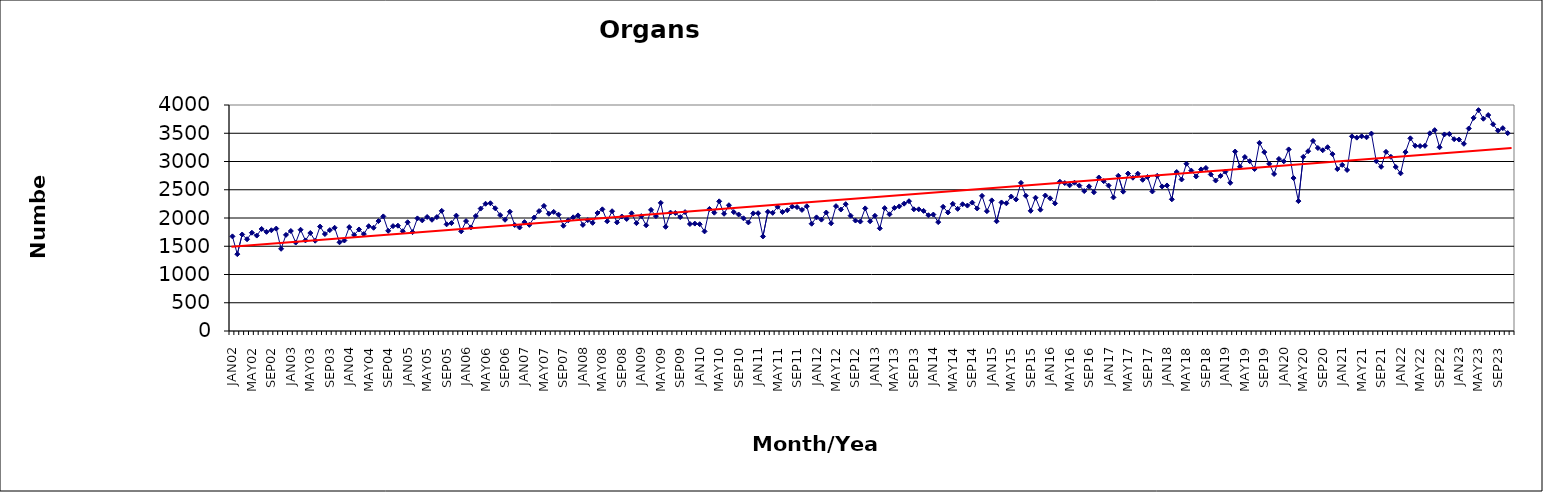
| Category | Series 0 |
|---|---|
| JAN02 | 1675 |
| FEB02 | 1360 |
| MAR02 | 1708 |
| APR02 | 1624 |
| MAY02 | 1740 |
| JUN02 | 1689 |
| JUL02 | 1806 |
| AUG02 | 1755 |
| SEP02 | 1783 |
| OCT02 | 1813 |
| NOV02 | 1455 |
| DEC02 | 1701 |
| JAN03 | 1770 |
| FEB03 | 1565 |
| MAR03 | 1792 |
| APR03 | 1603 |
| MAY03 | 1734 |
| JUN03 | 1598 |
| JUL03 | 1848 |
| AUG03 | 1716 |
| SEP03 | 1785 |
| OCT03 | 1827 |
| NOV03 | 1570 |
| DEC03 | 1602 |
| JAN04 | 1839 |
| FEB04 | 1700 |
| MAR04 | 1797 |
| APR04 | 1715 |
| MAY04 | 1855 |
| JUN04 | 1827 |
| JUL04 | 1946 |
| AUG04 | 2028 |
| SEP04 | 1773 |
| OCT04 | 1857 |
| NOV04 | 1864 |
| DEC04 | 1766 |
| JAN05 | 1925 |
| FEB05 | 1750 |
| MAR05 | 1993 |
| APR05 | 1958 |
| MAY05 | 2018 |
| JUN05 | 1969 |
| JUL05 | 2016 |
| AUG05 | 2127 |
| SEP05 | 1888 |
| OCT05 | 1910 |
| NOV05 | 2042 |
| DEC05 | 1764 |
| JAN06 | 1945 |
| FEB06 | 1834 |
| MAR06 | 2035 |
| APR06 | 2167 |
| MAY06 | 2252 |
| JUN06 | 2261 |
| JUL06 | 2172 |
| AUG06 | 2051 |
| SEP06 | 1969 |
| OCT06 | 2111 |
| NOV06 | 1876 |
| DEC06 | 1832 |
| JAN07 | 1927 |
| FEB07 | 1878 |
| MAR07 | 2009 |
| APR07 | 2122 |
| MAY07 | 2214 |
| JUN07 | 2076 |
| JUL07 | 2108 |
| AUG07 | 2060 |
| SEP07 | 1863 |
| OCT07 | 1959 |
| NOV07 | 2012 |
| DEC07 | 2046 |
| JAN08 | 1878 |
| FEB08 | 1962 |
| MAR08 | 1914 |
| APR08 | 2089 |
| MAY08 | 2153 |
| JUN08 | 1942 |
| JUL08 | 2120 |
| AUG08 | 1923 |
| SEP08 | 2026 |
| OCT08 | 1983 |
| NOV08 | 2083 |
| DEC08 | 1909 |
| JAN09 | 2033 |
| FEB09 | 1871 |
| MAR09 | 2144 |
| APR09 | 2033 |
| MAY09 | 2268 |
| JUN09 | 1844 |
| JUL09 | 2096 |
| AUG09 | 2089 |
| SEP09 | 2016 |
| OCT09 | 2104 |
| NOV09 | 1894 |
| DEC09 | 1901 |
| JAN10 | 1890 |
| FEB10 | 1763 |
| MAR10 | 2160 |
| APR10 | 2094 |
| MAY10 | 2295 |
| JUN10 | 2075 |
| JUL10 | 2226 |
| AUG10 | 2105 |
| SEP10 | 2062 |
| OCT10 | 1995 |
| NOV10 | 1922 |
| DEC10 | 2082 |
| JAN11 | 2085 |
| FEB11 | 1674 |
| MAR11 | 2109 |
| APR11 | 2091 |
| MAY11 | 2198 |
| JUN11 | 2106 |
| JUL11 | 2137 |
| AUG11 | 2202 |
| SEP11 | 2193 |
| OCT11 | 2143 |
| NOV11 | 2208 |
| DEC11 | 1899 |
| JAN12 | 2011 |
| FEB12 | 1971 |
| MAR12 | 2097 |
| APR12 | 1906 |
| MAY12 | 2210 |
| JUN12 | 2150 |
| JUL12 | 2245 |
| AUG12 | 2041 |
| SEP12 | 1955 |
| OCT12 | 1937 |
| NOV12 | 2170 |
| DEC12 | 1942 |
| JAN13 | 2039 |
| FEB13 | 1817 |
| MAR13 | 2175 |
| APR13 | 2065 |
| MAY13 | 2179 |
| JUN13 | 2205 |
| JUL13 | 2254 |
| AUG13 | 2297 |
| SEP13 | 2154 |
| OCT13 | 2154 |
| NOV13 | 2126 |
| DEC13 | 2049 |
| JAN14 | 2061 |
| FEB14 | 1927 |
| MAR14 | 2198 |
| APR14 | 2098 |
| MAY14 | 2251 |
| JUN14 | 2162 |
| JUL14 | 2243 |
| AUG14 | 2220 |
| SEP14 | 2273 |
| OCT14 | 2169 |
| NOV14 | 2392 |
| DEC14 | 2121 |
| JAN15 | 2312 |
| FEB15 | 1942 |
| MAR15 | 2275 |
| APR15 | 2260 |
| MAY15 | 2380 |
| JUN15 | 2329 |
| JUL15 | 2622 |
| AUG15 | 2394 |
| SEP15 | 2127 |
| OCT15 | 2359 |
| NOV15 | 2147 |
| DEC15 | 2398 |
| JAN16 | 2348 |
| FEB16 | 2259 |
| MAR16 | 2642 |
| APR16 | 2619 |
| MAY16 | 2578 |
| JUN16 | 2624 |
| JUL16 | 2573 |
| AUG16 | 2477 |
| SEP16 | 2560 |
| OCT16 | 2456 |
| NOV16 | 2717 |
| DEC16 | 2652 |
| JAN17 | 2574 |
| FEB17 | 2364 |
| MAR17 | 2747 |
| APR17 | 2466 |
| MAY17 | 2787 |
| JUN17 | 2713 |
| JUL17 | 2785 |
| AUG17 | 2676 |
| SEP17 | 2726 |
| OCT17 | 2470 |
| NOV17 | 2747 |
| DEC17 | 2558 |
| JAN18 | 2576 |
| FEB18 | 2331 |
| MAR18 | 2814 |
| APR18 | 2682 |
| MAY18 | 2960 |
| JUN18 | 2839 |
| JUL18 | 2735 |
| AUG18 | 2860 |
| SEP18 | 2886 |
| OCT18 | 2770 |
| NOV18 | 2663 |
| DEC18 | 2745 |
| JAN19 | 2820 |
| FEB19 | 2623 |
| MAR19 | 3176 |
| APR19 | 2907 |
| MAY19 | 3079 |
| JUN19 | 3005 |
| JUL19 | 2867 |
| AUG19 | 3330 |
| SEP19 | 3166 |
| OCT19 | 2958 |
| NOV19 | 2779 |
| DEC19 | 3045 |
| JAN20 | 3003 |
| FEB20 | 3214 |
| MAR20 | 2707 |
| APR20 | 2299 |
| MAY20 | 3082 |
| JUN20 | 3183 |
| JUL20 | 3364 |
| AUG20 | 3239 |
| SEP20 | 3199 |
| OCT20 | 3253 |
| NOV20 | 3131 |
| DEC20 | 2866 |
| JAN21 | 2940 |
| FEB21 | 2850 |
| MAR21 | 3445 |
| APR21 | 3422 |
| MAY21 | 3446 |
| JUN21 | 3429 |
| JUL21 | 3494 |
| AUG21 | 3006 |
| SEP21 | 2906 |
| OCT21 | 3171 |
| NOV21 | 3083 |
| DEC21 | 2903 |
| JAN22 | 2791 |
| FEB22 | 3166 |
| MAR22 | 3410 |
| APR22 | 3279 |
| MAY22 | 3273 |
| JUN22 | 3278 |
| JUL22 | 3499 |
| AUG22 | 3555 |
| SEP22 | 3252 |
| OCT22 | 3479 |
| NOV22 | 3487 |
| DEC22 | 3395 |
| JAN23 | 3388 |
| FEB23 | 3313 |
| MAR23 | 3584 |
| APR23 | 3772 |
| MAY23 | 3909 |
| JUN23 | 3757 |
| JUL23 | 3822 |
| AUG23 | 3659 |
| SEP23 | 3546 |
| OCT23 | 3590 |
| NOV23 | 3502 |